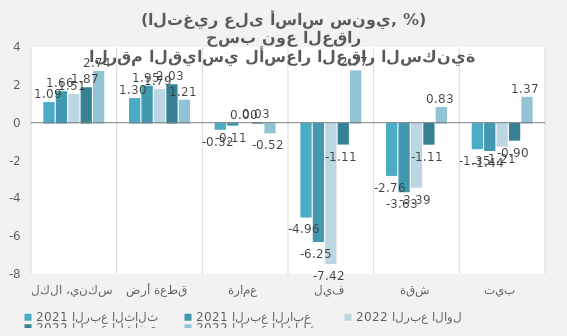
| Category | 2021 | 2022 |
|---|---|---|
| سكني، الكل | 1.664 | 2.735 |
| قطعة أرض | 1.955 | 1.212 |
| عمارة | -0.108 | -0.515 |
| فيلا | -6.254 | 2.765 |
| شقة | -3.627 | 0.826 |
| بيت | -1.445 | 1.366 |